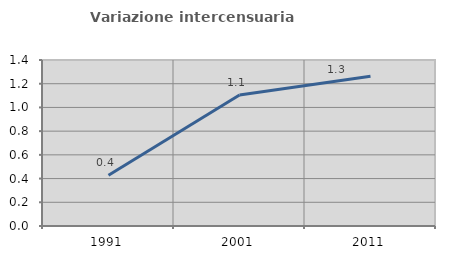
| Category | Variazione intercensuaria annua |
|---|---|
| 1991.0 | 0.428 |
| 2001.0 | 1.105 |
| 2011.0 | 1.264 |